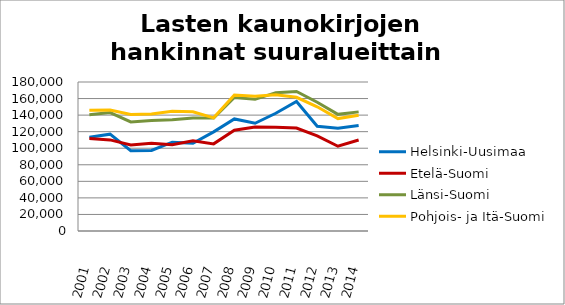
| Category | Helsinki-Uusimaa | Etelä-Suomi | Länsi-Suomi | Pohjois- ja Itä-Suomi |
|---|---|---|---|---|
| 2001.0 | 113144 | 111691 | 140512 | 145749 |
| 2002.0 | 116963 | 110059 | 143082 | 146073 |
| 2003.0 | 96995 | 103937 | 131734 | 140635 |
| 2004.0 | 97353 | 106130 | 133500 | 141320 |
| 2005.0 | 107310 | 104282 | 134289 | 144547 |
| 2006.0 | 105901 | 109122 | 136603 | 144130 |
| 2007.0 | 119769 | 105264 | 136450 | 136718 |
| 2008.0 | 135367 | 121820 | 161244 | 164234 |
| 2009.0 | 130185 | 125610 | 159046 | 162834 |
| 2010.0 | 142238 | 125443 | 167132 | 164555 |
| 2011.0 | 156432 | 124328 | 168573 | 161510 |
| 2012.0 | 126492 | 114845 | 155511 | 150036 |
| 2013.0 | 124283 | 102386 | 140905 | 135811 |
| 2014.0 | 127553 | 109928 | 143903 | 139806 |